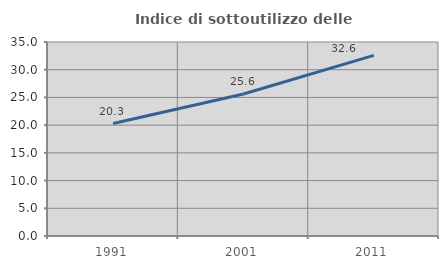
| Category | Indice di sottoutilizzo delle abitazioni  |
|---|---|
| 1991.0 | 20.285 |
| 2001.0 | 25.626 |
| 2011.0 | 32.584 |